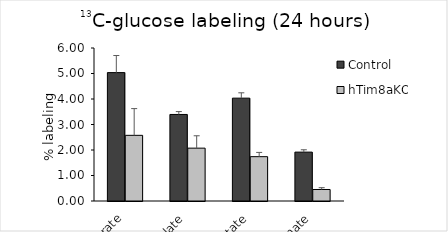
| Category | Control | hTim8aKO |
|---|---|---|
| Fumarate | 5.035 | 2.575 |
| Malate | 3.394 | 2.073 |
| Aspartate | 4.034 | 1.739 |
| Glutamate | 1.917 | 0.451 |